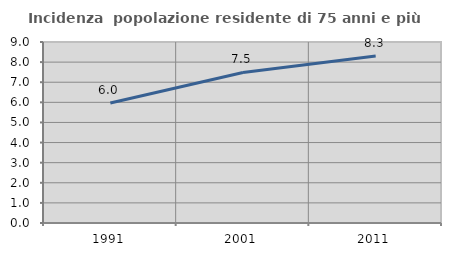
| Category | Incidenza  popolazione residente di 75 anni e più |
|---|---|
| 1991.0 | 5.971 |
| 2001.0 | 7.486 |
| 2011.0 | 8.308 |